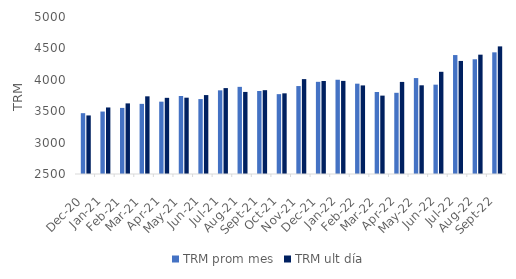
| Category | TRM prom mes | TRM ult día |
|---|---|---|
| 2020-12-01 | 3468.5 | 3432.5 |
| 2021-01-01 | 3494.53 | 3559.46 |
| 2021-02-01 | 3552.43 | 3624.39 |
| 2021-03-01 | 3617 | 3736.91 |
| 2021-04-01 | 3651.85 | 3712.89 |
| 2021-05-01 | 3741.96 | 3715.28 |
| 2021-06-01 | 3693 | 3756.67 |
| 2021-07-01 | 3832.24 | 3867.88 |
| 2021-08-01 | 3887.68 | 3806.87 |
| 2021-09-01 | 3821.54 | 3834.68 |
| 2021-10-01 | 3771.68 | 3784.44 |
| 2021-11-01 | 3900.51 | 4010.98 |
| 2021-12-01 | 3967.77 | 3981.16 |
| 2022-01-01 | 4000.72 | 3982.6 |
| 2022-02-01 | 3938.36 | 3910.64 |
| 2022-03-01 | 3805.52 | 3748.15 |
| 2022-04-01 | 3792.98 | 3966.27 |
| 2022-05-01 | 4027.6 | 3912.34 |
| 2022-06-01 | 3922.5 | 4127.47 |
| 2022-07-01 | 4394.01 | 4300.3 |
| 2022-08-01 | 4326.77 | 4400.16 |
| 2022-09-01 | 4437.31 | 4532.07 |